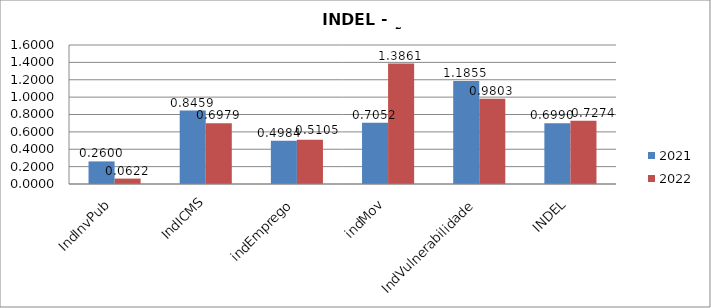
| Category | 2021 | 2022 |
|---|---|---|
| IndInvPub | 0.26 | 0.062 |
| IndICMS | 0.846 | 0.698 |
| indEmprego | 0.498 | 0.511 |
| indMov | 0.705 | 1.386 |
| IndVulnerabilidade | 1.185 | 0.98 |
| INDEL | 0.699 | 0.727 |